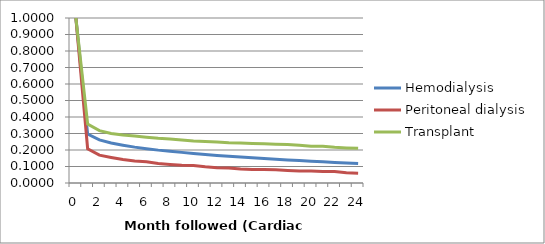
| Category | Hemodialysis | Peritoneal dialysis | Transplant |
|---|---|---|---|
| 0.0 | 1 | 1 | 1 |
| 1.0 | 0.297 | 0.208 | 0.358 |
| 2.0 | 0.261 | 0.169 | 0.318 |
| 3.0 | 0.242 | 0.155 | 0.301 |
| 4.0 | 0.229 | 0.142 | 0.291 |
| 5.0 | 0.217 | 0.134 | 0.285 |
| 6.0 | 0.208 | 0.129 | 0.278 |
| 7.0 | 0.199 | 0.118 | 0.271 |
| 8.0 | 0.193 | 0.113 | 0.267 |
| 9.0 | 0.186 | 0.108 | 0.261 |
| 10.0 | 0.178 | 0.107 | 0.254 |
| 11.0 | 0.172 | 0.099 | 0.252 |
| 12.0 | 0.166 | 0.093 | 0.249 |
| 13.0 | 0.162 | 0.09 | 0.245 |
| 14.0 | 0.157 | 0.084 | 0.242 |
| 15.0 | 0.152 | 0.081 | 0.24 |
| 16.0 | 0.148 | 0.081 | 0.238 |
| 17.0 | 0.144 | 0.08 | 0.235 |
| 18.0 | 0.14 | 0.076 | 0.233 |
| 19.0 | 0.136 | 0.072 | 0.229 |
| 20.0 | 0.132 | 0.072 | 0.223 |
| 21.0 | 0.128 | 0.07 | 0.223 |
| 22.0 | 0.124 | 0.07 | 0.216 |
| 23.0 | 0.121 | 0.062 | 0.213 |
| 24.0 | 0.118 | 0.059 | 0.21 |